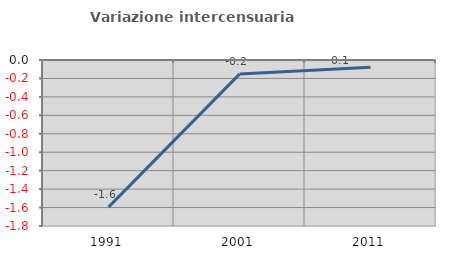
| Category | Variazione intercensuaria annua |
|---|---|
| 1991.0 | -1.595 |
| 2001.0 | -0.153 |
| 2011.0 | -0.077 |